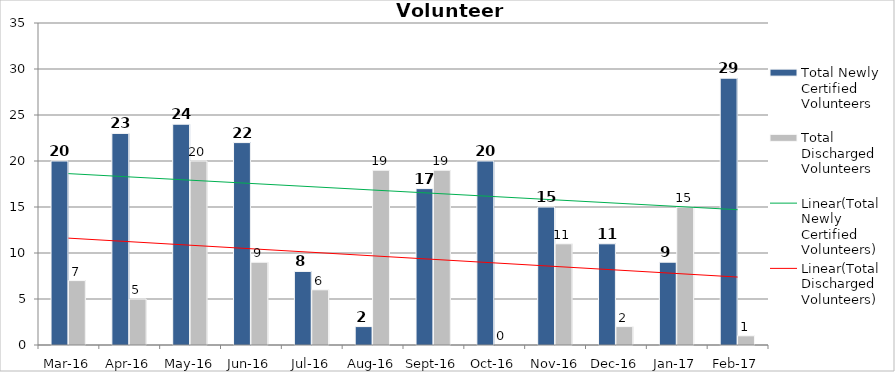
| Category | Total Newly Certified Volunteers | Total Discharged Volunteers |
|---|---|---|
| Mar-16 | 20 | 7 |
| Apr-16 | 23 | 5 |
| May-16 | 24 | 20 |
| Jun-16 | 22 | 9 |
| Jul-16 | 8 | 6 |
| Aug-16 | 2 | 19 |
| Sep-16 | 17 | 19 |
| Oct-16 | 20 | 0 |
| Nov-16 | 15 | 11 |
| Dec-16 | 11 | 2 |
| Jan-17 | 9 | 15 |
| Feb-17 | 29 | 1 |